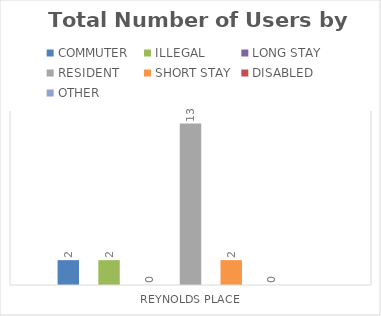
| Category | COMMUTER | ILLEGAL | LONG STAY | RESIDENT | SHORT STAY | DISABLED | OTHER |
|---|---|---|---|---|---|---|---|
| REYNOLDS PLACE | 2 | 2 | 0 | 13 | 2 | 0 | 0 |